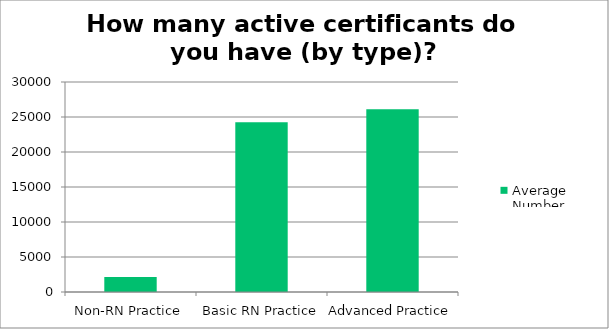
| Category | Average Number |
|---|---|
| Non-RN Practice | 2149.5 |
| Basic RN Practice | 24252.2 |
| Advanced Practice | 26096.182 |